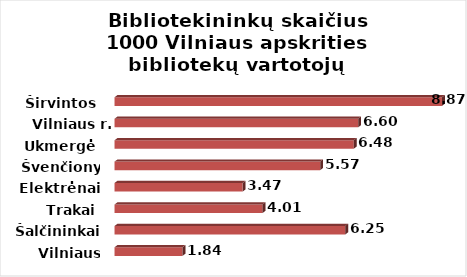
| Category | Series 0 |
|---|---|
| Vilniaus m. | 1.84 |
| Šalčininkai | 6.25 |
| Trakai | 4.01 |
| Elektrėnai | 3.47 |
| Švenčionys | 5.57 |
| Ukmergė | 6.48 |
| Vilniaus r. | 6.6 |
| Širvintos | 8.87 |